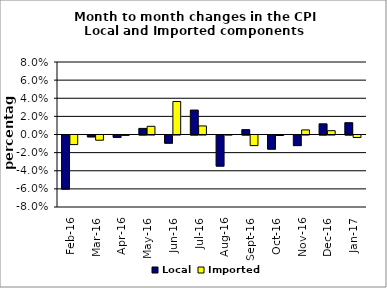
| Category | Local | Imported |
|---|---|---|
| 2016-02-01 | -0.06 | -0.011 |
| 2016-03-01 | -0.002 | -0.006 |
| 2016-04-01 | -0.003 | 0 |
| 2016-05-01 | 0.007 | 0.009 |
| 2016-06-01 | -0.009 | 0.036 |
| 2016-07-01 | 0.027 | 0.009 |
| 2016-08-01 | -0.034 | 0 |
| 2016-09-01 | 0.005 | -0.012 |
| 2016-10-01 | -0.016 | -0.001 |
| 2016-11-01 | -0.012 | 0.005 |
| 2016-12-01 | 0.012 | 0.004 |
| 2017-01-01 | 0.013 | -0.003 |